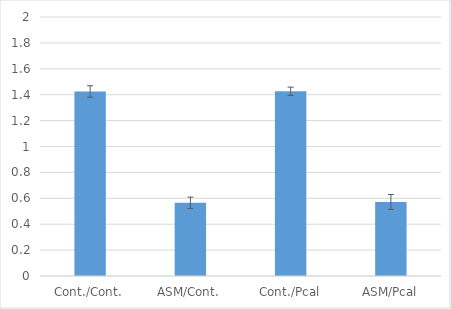
| Category | Series 0 |
|---|---|
| Cont./Cont. | 1.425 |
| ASM/Cont. | 0.565 |
| Cont./Pcal | 1.427 |
| ASM/Pcal | 0.572 |